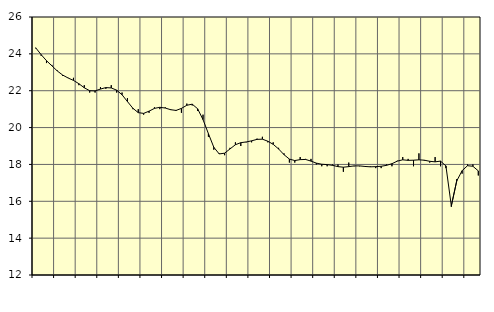
| Category | Piggar | Tillverkning o utvinning, energi o miljö, SNI 05-33, 35-391 |
|---|---|---|
| nan | 24.3 | 24.33 |
| 1.0 | 23.9 | 23.96 |
| 1.0 | 23.5 | 23.63 |
| 1.0 | 23.4 | 23.35 |
| nan | 23.1 | 23.07 |
| 2.0 | 22.8 | 22.85 |
| 2.0 | 22.7 | 22.69 |
| 2.0 | 22.7 | 22.56 |
| nan | 22.3 | 22.38 |
| 3.0 | 22.3 | 22.16 |
| 3.0 | 21.9 | 22 |
| 3.0 | 21.9 | 21.99 |
| nan | 22.2 | 22.09 |
| 4.0 | 22.1 | 22.17 |
| 4.0 | 22.3 | 22.15 |
| 4.0 | 21.9 | 22.03 |
| nan | 21.9 | 21.78 |
| 5.0 | 21.6 | 21.41 |
| 5.0 | 21 | 21.05 |
| 5.0 | 21 | 20.81 |
| nan | 20.7 | 20.77 |
| 6.0 | 20.8 | 20.89 |
| 6.0 | 21.1 | 21.04 |
| 6.0 | 21 | 21.1 |
| nan | 21.1 | 21.06 |
| 7.0 | 21 | 20.97 |
| 7.0 | 20.9 | 20.93 |
| 7.0 | 20.8 | 21.04 |
| nan | 21.3 | 21.21 |
| 8.0 | 21.2 | 21.27 |
| 8.0 | 20.9 | 21.02 |
| 8.0 | 20.7 | 20.43 |
| nan | 19.5 | 19.67 |
| 9.0 | 18.8 | 18.93 |
| 9.0 | 18.6 | 18.57 |
| 9.0 | 18.5 | 18.61 |
| nan | 18.9 | 18.84 |
| 10.0 | 19.2 | 19.07 |
| 10.0 | 19 | 19.18 |
| 10.0 | 19.2 | 19.22 |
| nan | 19.2 | 19.28 |
| 11.0 | 19.4 | 19.36 |
| 11.0 | 19.5 | 19.37 |
| 11.0 | 19.2 | 19.26 |
| nan | 19.2 | 19.09 |
| 12.0 | 18.9 | 18.84 |
| 12.0 | 18.6 | 18.53 |
| 12.0 | 18.1 | 18.29 |
| nan | 18.1 | 18.21 |
| 13.0 | 18.4 | 18.26 |
| 13.0 | 18.3 | 18.27 |
| 13.0 | 18.3 | 18.18 |
| nan | 18 | 18.07 |
| 14.0 | 17.9 | 18.01 |
| 14.0 | 17.9 | 17.99 |
| 14.0 | 18 | 17.95 |
| nan | 18 | 17.88 |
| 15.0 | 17.6 | 17.85 |
| 15.0 | 18.1 | 17.88 |
| 15.0 | 17.9 | 17.92 |
| nan | 17.9 | 17.92 |
| 16.0 | 17.9 | 17.89 |
| 16.0 | 17.9 | 17.87 |
| 16.0 | 17.8 | 17.88 |
| nan | 17.8 | 17.9 |
| 17.0 | 18 | 17.95 |
| 17.0 | 17.9 | 18.04 |
| 17.0 | 18.2 | 18.18 |
| nan | 18.4 | 18.25 |
| 18.0 | 18.3 | 18.22 |
| 18.0 | 17.9 | 18.23 |
| 18.0 | 18.6 | 18.25 |
| nan | 18.2 | 18.23 |
| 19.0 | 18.1 | 18.17 |
| 19.0 | 18.4 | 18.14 |
| 19.0 | 17.9 | 18.18 |
| nan | 17.8 | 17.92 |
| 20.0 | 15.7 | 15.75 |
| 20.0 | 17.2 | 17.1 |
| 20.0 | 17.5 | 17.66 |
| nan | 18 | 17.93 |
| 21.0 | 18 | 17.9 |
| 21.0 | 17.4 | 17.65 |